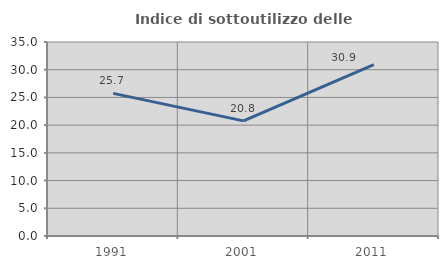
| Category | Indice di sottoutilizzo delle abitazioni  |
|---|---|
| 1991.0 | 25.728 |
| 2001.0 | 20.769 |
| 2011.0 | 30.933 |